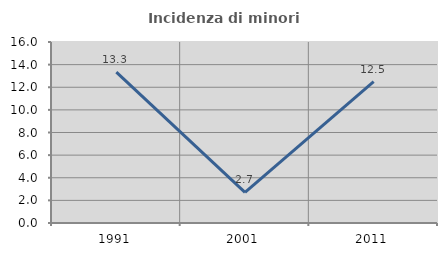
| Category | Incidenza di minori stranieri |
|---|---|
| 1991.0 | 13.333 |
| 2001.0 | 2.703 |
| 2011.0 | 12.5 |